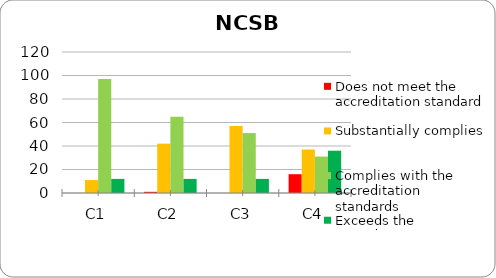
| Category | Does not meet the accreditation standard | Substantially complies | Complies with the accreditation standards | Exceeds the accreditation standards |
|---|---|---|---|---|
| C1 | 0 | 11 | 97 | 12 |
| C2 | 1 | 42 | 65 | 12 |
| C3 | 0 | 57 | 51 | 12 |
| C4 | 16 | 37 | 31 | 36 |